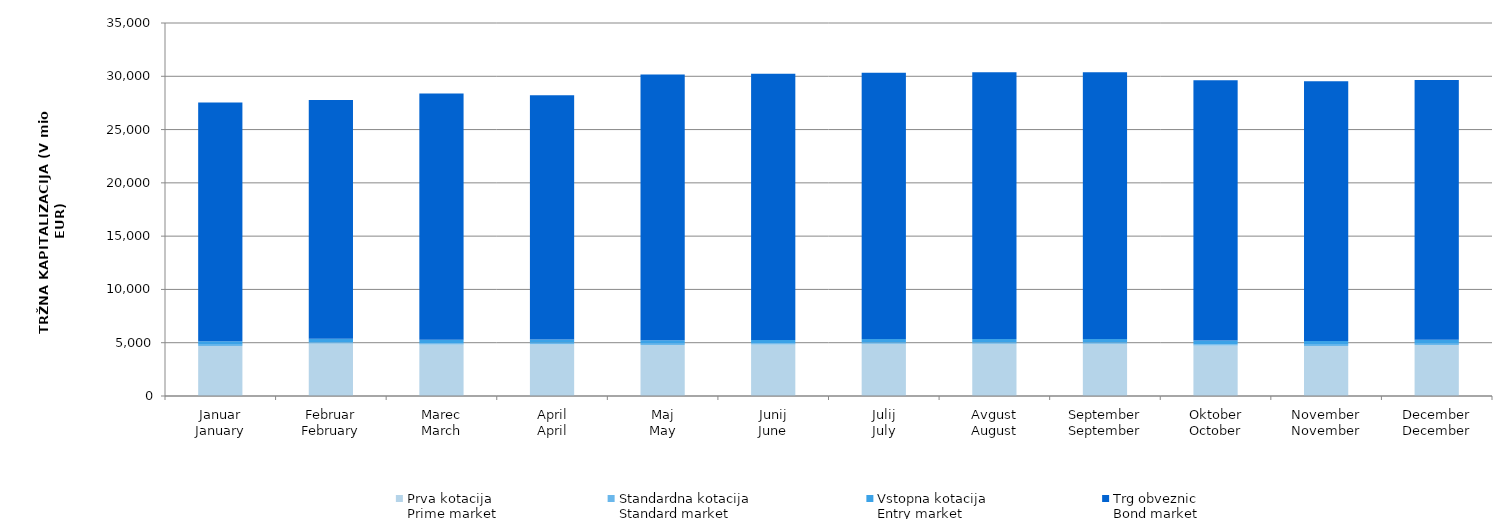
| Category | Prva kotacija
Prime market | Standardna kotacija
Standard market | Vstopna kotacija
Entry market | Trg obveznic
Bond market |
|---|---|---|---|---|
| Januar
January | 4688.414 | 119.147 | 322.07 | 22403.933 |
| Februar
February | 4916.545 | 122.105 | 344.612 | 22402.854 |
| Marec
March | 4828.693 | 118.055 | 334.1 | 23110.905 |
| April
April | 4867.53 | 117.955 | 318.781 | 22909.142 |
| Maj
May | 4786.994 | 113.695 | 341.504 | 24927.6 |
| Junij
June | 4832.853 | 111.76 | 319.63 | 24969.495 |
| Julij
July | 4903.797 | 114.648 | 336.708 | 24986.489 |
| Avgust
August | 4908.375 | 119.194 | 330.485 | 25019.195 |
| September
September | 4908.375 | 119.194 | 330.485 | 25019.195 |
| Oktober
October | 4736.385 | 121.586 | 342.796 | 24416.995 |
| November
November | 4694.664 | 119.892 | 341.788 | 24386.391 |
| December
December | 4791.547 | 117.85 | 364.488 | 24386.819 |